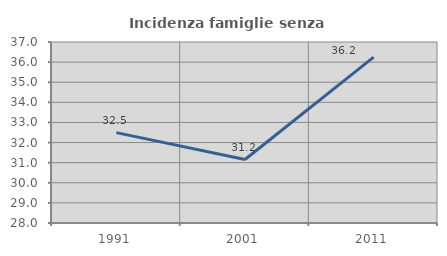
| Category | Incidenza famiglie senza nuclei |
|---|---|
| 1991.0 | 32.493 |
| 2001.0 | 31.157 |
| 2011.0 | 36.245 |